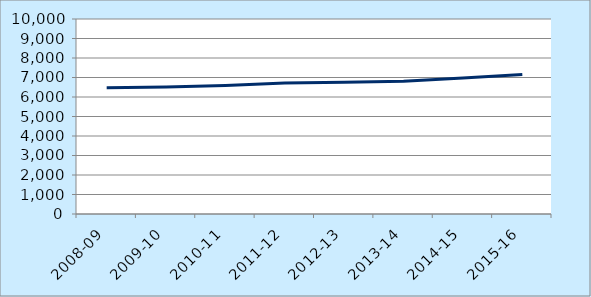
| Category | Average patient list size per practice |
|---|---|
| 2008-09 | 6476.44 |
| 2009-10 | 6506.581 |
| 2010-11 | 6587.778 |
| 2011-12 | 6720.544 |
| 2012-13 | 6760.637 |
| 2013-14 | 6807.563 |
| 2014-15 | 6975.362 |
| 2015-16 | 7156.214 |